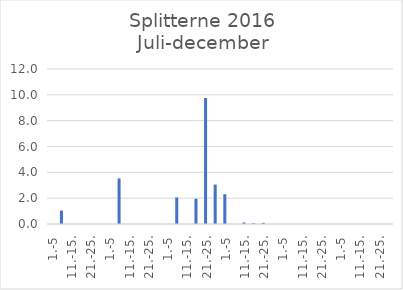
| Category | Series 0 |
|---|---|
| 1.-5 | 0 |
| 6.-10. | 1.041 |
| 11.-15. | 0 |
| 16.-20. | 0 |
| 21.-25. | 0 |
| 26.-31. | 0 |
| 1.-5 | 0 |
| 6.-10. | 3.53 |
| 11.-15. | 0 |
| 16.-20. | 0 |
| 21.-25. | 0 |
| 26.-31. | 0 |
| 1.-5 | 0 |
| 6.-10. | 2.056 |
| 11.-15. | 0 |
| 16.-20. | 1.961 |
| 21.-25. | 9.755 |
| 26.-30. | 3.054 |
| 1.-5 | 2.305 |
| 6.-10. | 0 |
| 11.-15. | 0.118 |
| 16.-20. | 0.056 |
| 21.-25. | 0.089 |
| 26.-31. | 0 |
| 1.-5 | 0 |
| 6.-10. | 0 |
| 11.-15. | 0 |
| 16.-20. | 0 |
| 21.-25. | 0 |
| 26.-30. | 0 |
| 1.-5 | 0 |
| 6.-10. | 0 |
| 11.-15. | 0 |
| 16.-20. | 0 |
| 21.-25. | 0 |
| 26.-31. | 0 |